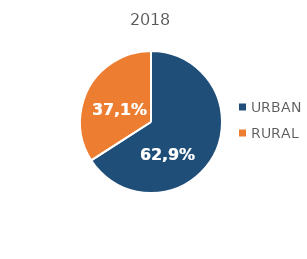
| Category | Gospodării care au calculator acasă |
|---|---|
| URBAN  | 0.659 |
| RURAL | 0.341 |